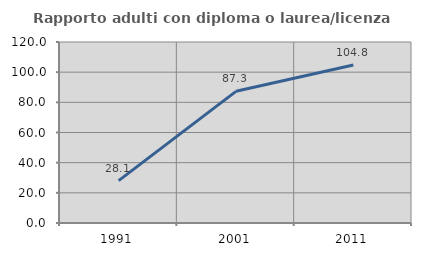
| Category | Rapporto adulti con diploma o laurea/licenza media  |
|---|---|
| 1991.0 | 28.058 |
| 2001.0 | 87.302 |
| 2011.0 | 104.783 |